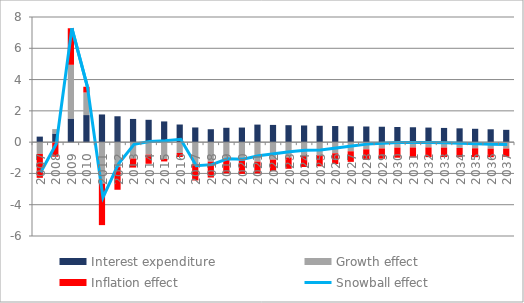
| Category | Interest expenditure | Growth effect | Inflation effect |
|---|---|---|---|
| 0 | 0.353 | -0.754 | -1.527 |
| 1 | 0.551 | 0.285 | -0.933 |
| 2 | 1.511 | 3.434 | 2.337 |
| 3 | 1.731 | 1.442 | 0.368 |
| 4 | 1.77 | -2.65 | -2.655 |
| 5 | 1.655 | -1.594 | -1.45 |
| 6 | 1.483 | -1.047 | -0.579 |
| 7 | 1.428 | -0.798 | -0.585 |
| 8 | 1.324 | -1.075 | -0.157 |
| 9 | 1.127 | -0.694 | -0.255 |
| 10 | 0.938 | -1.39 | -1.06 |
| 11 | 0.825 | -1.245 | -1.018 |
| 12 | 0.918 | -1.135 | -0.853 |
| 13 | 0.933 | -1.17 | -0.858 |
| 14 | 1.121 | -1.245 | -0.748 |
| 15 | 1.102 | -1.116 | -0.734 |
| 16 | 1.084 | -0.98 | -0.722 |
| 17 | 1.066 | -0.877 | -0.711 |
| 18 | 1.047 | -0.847 | -0.698 |
| 19 | 1.03 | -0.713 | -0.687 |
| 20 | 1.014 | -0.584 | -0.676 |
| 21 | 1 | -0.46 | -0.667 |
| 22 | 0.985 | -0.404 | -0.657 |
| 23 | 0.969 | -0.349 | -0.646 |
| 24 | 0.952 | -0.343 | -0.634 |
| 25 | 0.932 | -0.338 | -0.621 |
| 26 | 0.909 | -0.348 | -0.606 |
| 27 | 0.883 | -0.371 | -0.589 |
| 28 | 0.854 | -0.393 | -0.569 |
| 29 | 0.822 | -0.416 | -0.548 |
| 30 | 0.787 | -0.412 | -0.525 |